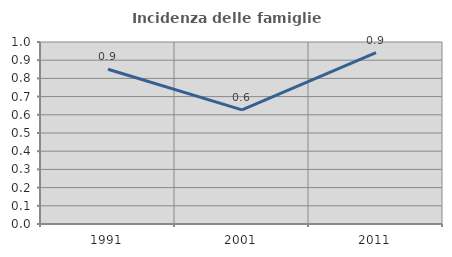
| Category | Incidenza delle famiglie numerose |
|---|---|
| 1991.0 | 0.85 |
| 2001.0 | 0.627 |
| 2011.0 | 0.941 |